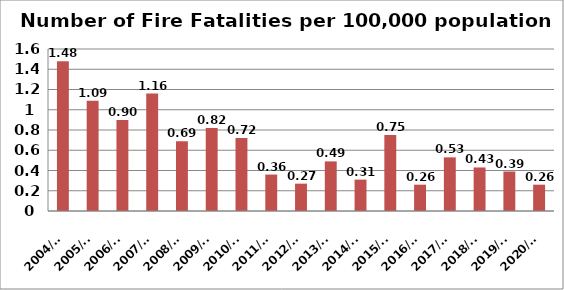
| Category | Series 0 |
|---|---|
| 2004/05 | 1.48 |
| 2005/06 | 1.09 |
| 2006/07 | 0.9 |
| 2007/08 | 1.16 |
| 2008/09 | 0.69 |
| 2009/10 | 0.82 |
| 2010/11 | 0.72 |
| 2011/12 | 0.36 |
| 2012/13 | 0.27 |
| 2013/14 | 0.49 |
| 2014/15 | 0.31 |
| 2015/16 | 0.75 |
| 2016/17 | 0.26 |
| 2017/18 | 0.53 |
| 2018/19 | 0.43 |
| 2019/20 | 0.39 |
| 2020/21 | 0.26 |